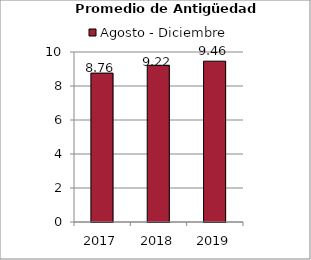
| Category | Agosto - Diciembre |
|---|---|
| 2017.0 | 8.76 |
| 2018.0 | 9.22 |
| 2019.0 | 9.46 |